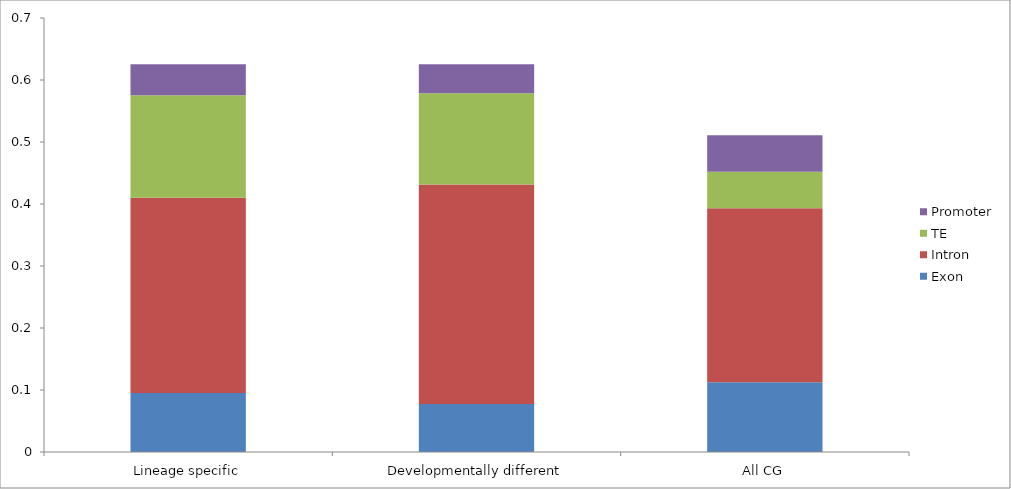
| Category | Exon | Intron | TE | Promoter |
|---|---|---|---|---|
| Lineage specific | 0.095 | 0.315 | 0.166 | 0.05 |
| Developmentally different | 0.078 | 0.354 | 0.147 | 0.047 |
| All CG | 0.113 | 0.281 | 0.059 | 0.059 |